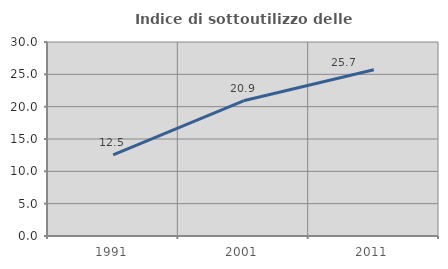
| Category | Indice di sottoutilizzo delle abitazioni  |
|---|---|
| 1991.0 | 12.545 |
| 2001.0 | 20.904 |
| 2011.0 | 25.712 |